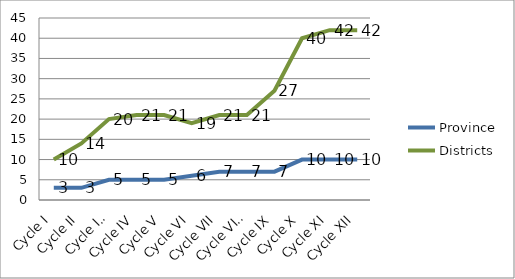
| Category | Province | Districts |
|---|---|---|
| Cycle I | 3 | 10 |
| Cycle II | 3 | 14 |
| Cycle III | 5 | 20 |
| Cycle IV | 5 | 21 |
| Cycle V | 5 | 21 |
| Cycle VI | 6 | 19 |
| Cycle VII | 7 | 21 |
| Cycle VIII | 7 | 21 |
| Cycle IX | 7 | 27 |
| Cycle X | 10 | 40 |
| Cycle XI | 10 | 42 |
| Cycle XII | 10 | 42 |